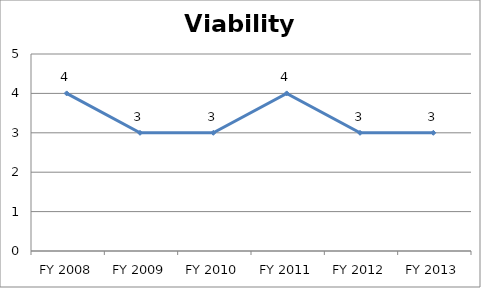
| Category | Viability score |
|---|---|
| FY 2013 | 3 |
| FY 2012 | 3 |
| FY 2011 | 4 |
| FY 2010 | 3 |
| FY 2009 | 3 |
| FY 2008 | 4 |